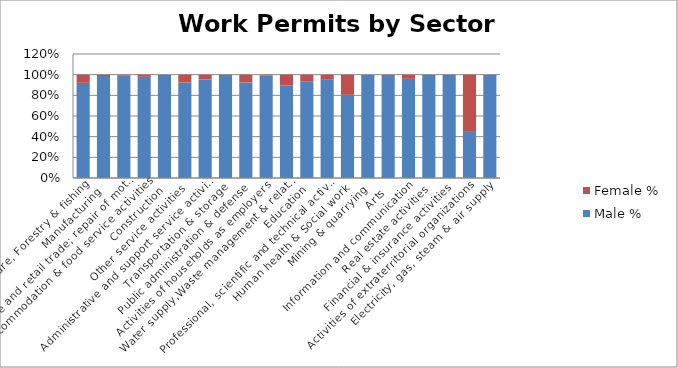
| Category | Male % | Female % |
|---|---|---|
| Agriculture, Forestry & fishing | 0.921 | 0.079 |
|  Manufacturing | 0.986 | 0.014 |
|  Wholesale and retail trade; repair of motor vehicles  | 0.992 | 0.008 |
|   Accommodation & food service activities | 0.979 | 0.021 |
|   Construction | 1 | 0 |
| Other service activities | 0.925 | 0.075 |
| Administrative and support service activities | 0.954 | 0.046 |
|   Transportation & storage | 0.999 | 0.001 |
| Public administration & defense | 0.925 | 0.075 |
| Activities of households as employers | 0.993 | 0.007 |
| Water supply,Waste management & related activities | 0.894 | 0.106 |
| Education | 0.932 | 0.068 |
| Professional, scientific and technical activities | 0.95 | 0.05 |
| Human health & Social work | 0.805 | 0.195 |
| Mining & quarrying | 1 | 0 |
| Arts | 0.989 | 0.011 |
|  Information and communication | 0.959 | 0.041 |
| Real estate activities | 1 | 0 |
|  Financial & insurance activities | 1 | 0 |
| Activities of extraterritorial organizations  | 0.446 | 0.554 |
| Electricity, gas, steam & air supply | 1 | 0 |